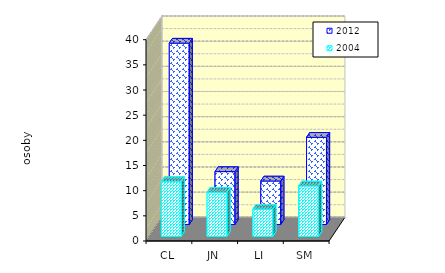
| Category | 2012 | 2004 |
|---|---|---|
| CL | 36.023 | 10.867 |
| JN | 10.5 | 8.75 |
| LI | 8.63 | 5.378 |
| SM | 17.313 | 10.007 |